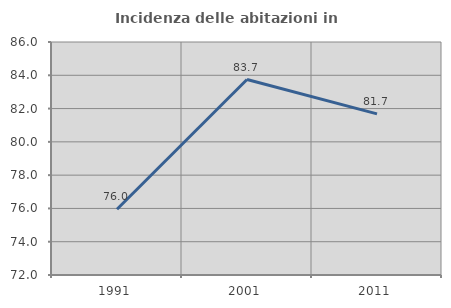
| Category | Incidenza delle abitazioni in proprietà  |
|---|---|
| 1991.0 | 75.954 |
| 2001.0 | 83.746 |
| 2011.0 | 81.682 |